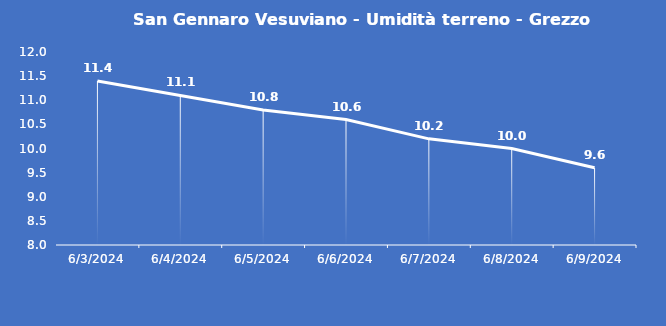
| Category | San Gennaro Vesuviano - Umidità terreno - Grezzo (%VWC) |
|---|---|
| 6/3/24 | 11.4 |
| 6/4/24 | 11.1 |
| 6/5/24 | 10.8 |
| 6/6/24 | 10.6 |
| 6/7/24 | 10.2 |
| 6/8/24 | 10 |
| 6/9/24 | 9.6 |